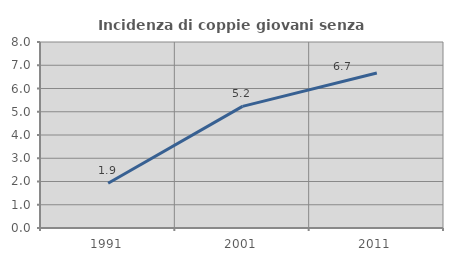
| Category | Incidenza di coppie giovani senza figli |
|---|---|
| 1991.0 | 1.923 |
| 2001.0 | 5.233 |
| 2011.0 | 6.667 |